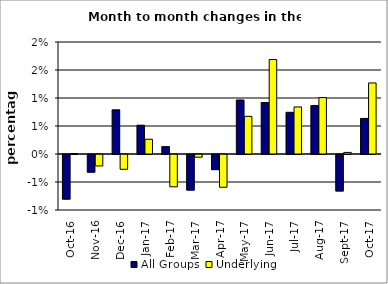
| Category | All Groups | Underlying |
|---|---|---|
| 2016-10-01 | -0.008 | 0 |
| 2016-11-01 | -0.003 | -0.002 |
| 2016-12-01 | 0.008 | -0.003 |
| 2017-01-01 | 0.005 | 0.003 |
| 2017-02-01 | 0.001 | -0.006 |
| 2017-03-01 | -0.006 | 0 |
| 2017-04-01 | -0.003 | -0.006 |
| 2017-05-01 | 0.01 | 0.007 |
| 2017-06-01 | 0.009 | 0.017 |
| 2017-07-01 | 0.007 | 0.008 |
| 2017-08-01 | 0.009 | 0.01 |
| 2017-09-01 | -0.007 | 0 |
| 2017-10-01 | 0.006 | 0.013 |